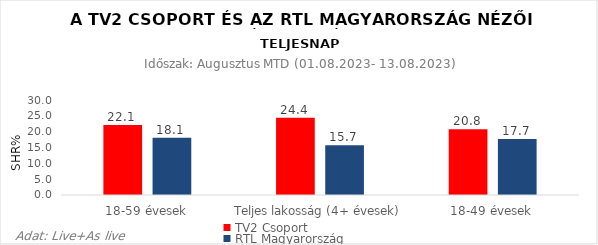
| Category | TV2 Csoport | RTL Magyarország |
|---|---|---|
| 18-59 évesek | 22.1 | 18.1 |
| Teljes lakosság (4+ évesek) | 24.4 | 15.7 |
| 18-49 évesek | 20.8 | 17.7 |